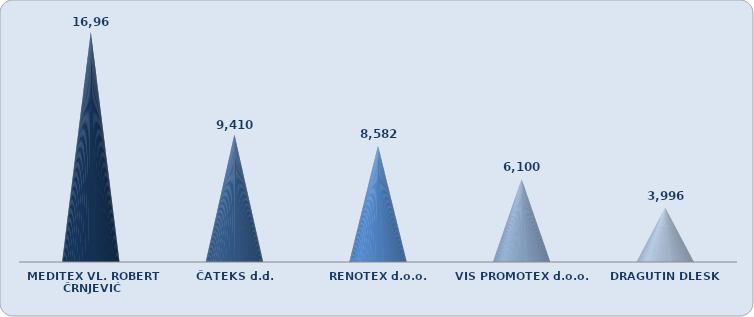
| Category | Dobit razdoblja |
|---|---|
| MEDITEX VL. ROBERT ČRNJEVIĆ | 16960.013 |
| ČATEKS d.d. | 9409.999 |
| RENOTEX d.o.o. | 8581.564 |
| VIS PROMOTEX d.o.o. | 6099.604 |
| DRAGUTIN DLESK | 3996.18 |